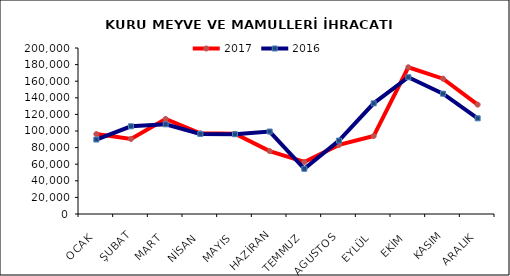
| Category | 2017 | 2016 |
|---|---|---|
| OCAK | 96331.294 | 89731.465 |
| ŞUBAT | 90408.285 | 105702.402 |
| MART | 114507.191 | 108063.881 |
| NİSAN | 97193.598 | 96465.707 |
| MAYIS | 96648.83 | 96136.856 |
| HAZİRAN | 75754.45 | 99356.713 |
| TEMMUZ | 62706.864 | 54463.914 |
| AGUSTOS | 83242.215 | 88426.43 |
| EYLÜL | 93906.195 | 133309.956 |
| EKİM | 176765.635 | 164789.312 |
| KASIM | 163027.041 | 144969.573 |
| ARALIK | 131746.888 | 115269.889 |